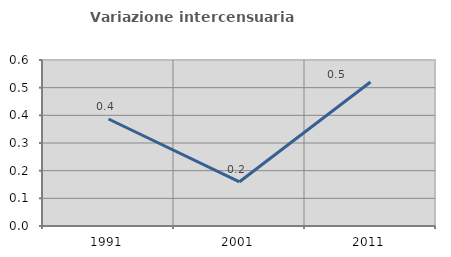
| Category | Variazione intercensuaria annua |
|---|---|
| 1991.0 | 0.387 |
| 2001.0 | 0.16 |
| 2011.0 | 0.521 |